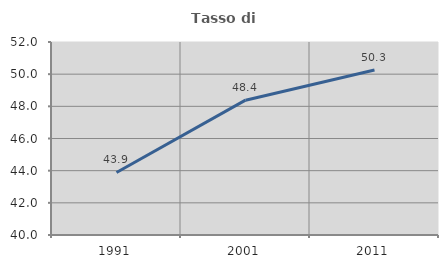
| Category | Tasso di occupazione   |
|---|---|
| 1991.0 | 43.888 |
| 2001.0 | 48.383 |
| 2011.0 | 50.264 |